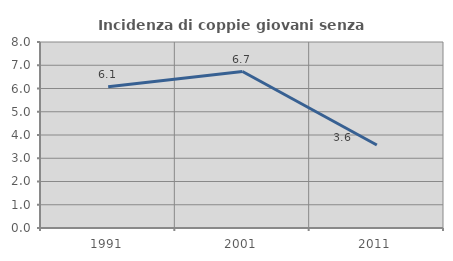
| Category | Incidenza di coppie giovani senza figli |
|---|---|
| 1991.0 | 6.075 |
| 2001.0 | 6.73 |
| 2011.0 | 3.571 |